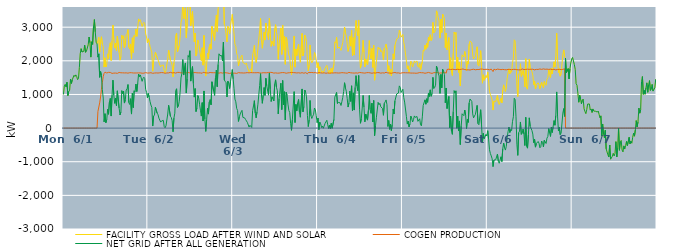
| Category | FACILITY GROSS LOAD AFTER WIND AND SOLAR | COGEN PRODUCTION | NET GRID AFTER ALL GENERATION |
|---|---|---|---|
|  Mon  6/1 | 1001 | 0 | 1001 |
|  Mon  6/1 | 1249 | 0 | 1249 |
|  Mon  6/1 | 1301 | 0 | 1301 |
|  Mon  6/1 | 1223 | 0 | 1223 |
|  Mon  6/1 | 1361 | 0 | 1361 |
|  Mon  6/1 | 967 | 0 | 967 |
|  Mon  6/1 | 1091 | 0 | 1091 |
|  Mon  6/1 | 1126 | 0 | 1126 |
|  Mon  6/1 | 1458 | 0 | 1458 |
|  Mon  6/1 | 1327 | 0 | 1327 |
|  Mon  6/1 | 1439 | 0 | 1439 |
|  Mon  6/1 | 1437 | 0 | 1437 |
|  Mon  6/1 | 1570 | 0 | 1570 |
|  Mon  6/1 | 1533 | 0 | 1533 |
|  Mon  6/1 | 1582 | 0 | 1582 |
|  Mon  6/1 | 1532 | 0 | 1532 |
|  Mon  6/1 | 1440 | 0 | 1440 |
|  Mon  6/1 | 1471 | 0 | 1471 |
|  Mon  6/1 | 1798 | 0 | 1798 |
|  Mon  6/1 | 2211 | 0 | 2211 |
|  Mon  6/1 | 2360 | 0 | 2360 |
|  Mon  6/1 | 2264 | 0 | 2264 |
|  Mon  6/1 | 2266 | 0 | 2266 |
|  Mon  6/1 | 2281 | 0 | 2281 |
|  Mon  6/1 | 2466 | 0 | 2466 |
|  Mon  6/1 | 2252 | 0 | 2252 |
|  Mon  6/1 | 2286 | 0 | 2286 |
|  Mon  6/1 | 2289 | 0 | 2289 |
|  Mon  6/1 | 2479 | 0 | 2479 |
|  Mon  6/1 | 2707 | 0 | 2707 |
|  Mon  6/1 | 2536 | 0 | 2536 |
|  Mon  6/1 | 2110 | 0 | 2110 |
|  Mon  6/1 | 2566 | 0 | 2566 |
|  Mon  6/1 | 2490 | 0 | 2490 |
|  Mon  6/1 | 3004 | 0 | 3004 |
|  Mon  6/1 | 3226 | 0 | 3226 |
|  Mon  6/1 | 2861 | 0 | 2861 |
|  Mon  6/1 | 2552 | 0 | 2552 |
|  Mon  6/1 | 2504 | 0 | 2504 |
|  Mon  6/1 | 2602 | 492 | 2110 |
|  Mon  6/1 | 2701 | 494 | 2207 |
|  Mon  6/1 | 2260 | 751 | 1509 |
|  Mon  6/1 | 2607 | 925 | 1682 |
|  Mon  6/1 | 2716 | 1152 | 1564 |
|  Mon  6/1 | 2489 | 1348 | 1141 |
|  Mon  6/1 | 2423 | 1530 | 893 |
|  Mon  6/1 | 1814 | 1629 | 185 |
|  Mon  6/1 | 2091 | 1663 | 428 |
|  Mon  6/1 | 1817 | 1657 | 160 |
|  Mon  6/1 | 1893 | 1638 | 255 |
|  Mon  6/1 | 2207 | 1648 | 559 |
|  Mon  6/1 | 2068 | 1657 | 411 |
|  Mon  6/1 | 2423 | 1650 | 773 |
|  Mon  6/1 | 2537 | 1654 | 883 |
|  Mon  6/1 | 2010 | 1652 | 358 |
|  Mon  6/1 | 2604 | 1626 | 978 |
|  Mon  6/1 | 3063 | 1638 | 1425 |
|  Mon  6/1 | 2615 | 1635 | 980 |
|  Mon  6/1 | 2379 | 1644 | 735 |
|  Mon  6/1 | 2525 | 1636 | 889 |
|  Mon  6/1 | 2305 | 1638 | 667 |
|  Mon  6/1 | 2736 | 1628 | 1108 |
|  Mon  6/1 | 2750 | 1626 | 1124 |
|  Mon  6/1 | 2245 | 1654 | 591 |
|  Mon  6/1 | 2020 | 1630 | 390 |
|  Mon  6/1 | 2123 | 1644 | 479 |
|  Mon  6/1 | 2760 | 1647 | 1113 |
|  Mon  6/1 | 2667 | 1643 | 1024 |
|  Mon  6/1 | 2742 | 1640 | 1102 |
|  Mon  6/1 | 2384 | 1640 | 744 |
|  Mon  6/1 | 2488 | 1646 | 842 |
|  Mon  6/1 | 2775 | 1642 | 1133 |
|  Mon  6/1 | 2807 | 1640 | 1167 |
|  Mon  6/1 | 2929 | 1634 | 1295 |
|  Mon  6/1 | 2405 | 1647 | 758 |
|  Mon  6/1 | 2348 | 1647 | 701 |
|  Mon  6/1 | 2501 | 1627 | 874 |
|  Mon  6/1 | 2063 | 1646 | 417 |
|  Mon  6/1 | 2684 | 1641 | 1043 |
|  Mon  6/1 | 2247 | 1638 | 609 |
|  Mon  6/1 | 2755 | 1645 | 1110 |
|  Mon  6/1 | 2713 | 1638 | 1075 |
|  Mon  6/1 | 2946 | 1637 | 1309 |
|  Mon  6/1 | 2727 | 1639 | 1088 |
|  Mon  6/1 | 2962 | 1634 | 1328 |
|  Mon  6/1 | 3246 | 1640 | 1606 |
|  Mon  6/1 | 3175 | 1645 | 1530 |
|  Mon  6/1 | 3223 | 1642 | 1581 |
|  Mon  6/1 | 3235 | 1651 | 1584 |
|  Mon  6/1 | 3021 | 1631 | 1390 |
|  Mon  6/1 | 3108 | 1636 | 1472 |
|  Mon  6/1 | 3146 | 1633 | 1513 |
|  Mon  6/1 | 3106 | 1635 | 1471 |
|  Mon  6/1 | 2802 | 1649 | 1153 |
|  Mon  6/1 | 2710 | 1647 | 1063 |
|  Mon  6/1 | 2532 | 1636 | 896 |
|  Tue  6/2 | 2655 | 1623 | 1032 |
|  Tue  6/2 | 2560 | 1639 | 921 |
|  Tue  6/2 | 2427 | 1641 | 786 |
|  Tue  6/2 | 2332 | 1646 | 686 |
|  Tue  6/2 | 2258 | 1643 | 615 |
|  Tue  6/2 | 1690 | 1629 | 61 |
|  Tue  6/2 | 2000 | 1643 | 357 |
|  Tue  6/2 | 2028 | 1637 | 391 |
|  Tue  6/2 | 2259 | 1639 | 620 |
|  Tue  6/2 | 2240 | 1641 | 599 |
|  Tue  6/2 | 2097 | 1651 | 446 |
|  Tue  6/2 | 2035 | 1637 | 398 |
|  Tue  6/2 | 1948 | 1652 | 296 |
|  Tue  6/2 | 1965 | 1644 | 321 |
|  Tue  6/2 | 1819 | 1641 | 178 |
|  Tue  6/2 | 1862 | 1650 | 212 |
|  Tue  6/2 | 1859 | 1630 | 229 |
|  Tue  6/2 | 1875 | 1646 | 229 |
|  Tue  6/2 | 1697 | 1653 | 44 |
|  Tue  6/2 | 1640 | 1630 | 10 |
|  Tue  6/2 | 1713 | 1646 | 67 |
|  Tue  6/2 | 1687 | 1640 | 47 |
|  Tue  6/2 | 2069 | 1651 | 418 |
|  Tue  6/2 | 2319 | 1641 | 678 |
|  Tue  6/2 | 2299 | 1646 | 653 |
|  Tue  6/2 | 2011 | 1658 | 353 |
|  Tue  6/2 | 1961 | 1647 | 314 |
|  Tue  6/2 | 1857 | 1639 | 218 |
|  Tue  6/2 | 1522 | 1631 | -109 |
|  Tue  6/2 | 1946 | 1648 | 298 |
|  Tue  6/2 | 2095 | 1651 | 444 |
|  Tue  6/2 | 2752 | 1635 | 1117 |
|  Tue  6/2 | 2823 | 1654 | 1169 |
|  Tue  6/2 | 2266 | 1655 | 611 |
|  Tue  6/2 | 2290 | 1641 | 649 |
|  Tue  6/2 | 2455 | 1656 | 799 |
|  Tue  6/2 | 2707 | 1639 | 1068 |
|  Tue  6/2 | 3132 | 1640 | 1492 |
|  Tue  6/2 | 3259 | 1634 | 1625 |
|  Tue  6/2 | 3677 | 1640 | 2037 |
|  Tue  6/2 | 3244 | 1667 | 1577 |
|  Tue  6/2 | 3244 | 1645 | 1599 |
|  Tue  6/2 | 3573 | 1637 | 1936 |
|  Tue  6/2 | 2684 | 1642 | 1042 |
|  Tue  6/2 | 3111 | 1648 | 1463 |
|  Tue  6/2 | 3810 | 1653 | 2157 |
|  Tue  6/2 | 3759 | 1650 | 2109 |
|  Tue  6/2 | 3942 | 1641 | 2301 |
|  Tue  6/2 | 3042 | 1645 | 1397 |
|  Tue  6/2 | 3050 | 1637 | 1413 |
|  Tue  6/2 | 3471 | 1644 | 1827 |
|  Tue  6/2 | 2966 | 1646 | 1320 |
|  Tue  6/2 | 2565 | 1644 | 921 |
|  Tue  6/2 | 2826 | 1651 | 1175 |
|  Tue  6/2 | 2142 | 1650 | 492 |
|  Tue  6/2 | 2238 | 1643 | 595 |
|  Tue  6/2 | 2614 | 1645 | 969 |
|  Tue  6/2 | 2534 | 1642 | 892 |
|  Tue  6/2 | 2344 | 1636 | 708 |
|  Tue  6/2 | 2172 | 1640 | 532 |
|  Tue  6/2 | 2005 | 1648 | 357 |
|  Tue  6/2 | 2388 | 1630 | 758 |
|  Tue  6/2 | 1870 | 1660 | 210 |
|  Tue  6/2 | 2755 | 1651 | 1104 |
|  Tue  6/2 | 1916 | 1646 | 270 |
|  Tue  6/2 | 1546 | 1645 | -99 |
|  Tue  6/2 | 1893 | 1640 | 253 |
|  Tue  6/2 | 2231 | 1641 | 590 |
|  Tue  6/2 | 2054 | 1638 | 416 |
|  Tue  6/2 | 2418 | 1641 | 777 |
|  Tue  6/2 | 2501 | 1653 | 848 |
|  Tue  6/2 | 2346 | 1653 | 693 |
|  Tue  6/2 | 3024 | 1647 | 1377 |
|  Tue  6/2 | 3014 | 1640 | 1374 |
|  Tue  6/2 | 2736 | 1646 | 1090 |
|  Tue  6/2 | 2605 | 1633 | 972 |
|  Tue  6/2 | 3139 | 1645 | 1494 |
|  Tue  6/2 | 3363 | 1636 | 1727 |
|  Tue  6/2 | 2871 | 1641 | 1230 |
|  Tue  6/2 | 3539 | 1647 | 1892 |
|  Tue  6/2 | 3843 | 1634 | 2209 |
|  Tue  6/2 | 3817 | 1660 | 2157 |
|  Tue  6/2 | 3791 | 1647 | 2144 |
|  Tue  6/2 | 3804 | 1650 | 2154 |
|  Tue  6/2 | 3631 | 1635 | 1996 |
|  Tue  6/2 | 4210 | 1651 | 2559 |
|  Tue  6/2 | 3081 | 1649 | 1432 |
|  Tue  6/2 | 3016 | 1629 | 1387 |
|  Tue  6/2 | 2993 | 1643 | 1350 |
|  Tue  6/2 | 2563 | 1639 | 924 |
|  Tue  6/2 | 3029 | 1636 | 1393 |
|  Tue  6/2 | 2978 | 1650 | 1328 |
|  Tue  6/2 | 2800 | 1624 | 1176 |
|  Tue  6/2 | 3042 | 1652 | 1390 |
|  Tue  6/2 | 3028 | 1639 | 1389 |
|  Tue  6/2 | 3380 | 1640 | 1740 |
|  Wed  6/3 | 3096 | 1633 | 1463 |
|  Wed  6/3 | 2799 | 1628 | 1171 |
|  Wed  6/3 | 2495 | 1634 | 861 |
|  Wed  6/3 | 2427 | 1646 | 781 |
|  Wed  6/3 | 2210 | 1625 | 585 |
|  Wed  6/3 | 2159 | 1635 | 524 |
|  Wed  6/3 | 1847 | 1649 | 198 |
|  Wed  6/3 | 1981 | 1646 | 335 |
|  Wed  6/3 | 2062 | 1642 | 420 |
|  Wed  6/3 | 2128 | 1647 | 481 |
|  Wed  6/3 | 2169 | 1641 | 528 |
|  Wed  6/3 | 1964 | 1646 | 318 |
|  Wed  6/3 | 1928 | 1637 | 291 |
|  Wed  6/3 | 1957 | 1654 | 303 |
|  Wed  6/3 | 1899 | 1642 | 257 |
|  Wed  6/3 | 1936 | 1657 | 279 |
|  Wed  6/3 | 1821 | 1649 | 172 |
|  Wed  6/3 | 1817 | 1635 | 182 |
|  Wed  6/3 | 1674 | 1643 | 31 |
|  Wed  6/3 | 1724 | 1641 | 83 |
|  Wed  6/3 | 1761 | 1650 | 111 |
|  Wed  6/3 | 1658 | 1639 | 19 |
|  Wed  6/3 | 2167 | 1646 | 521 |
|  Wed  6/3 | 2294 | 1636 | 658 |
|  Wed  6/3 | 2461 | 1646 | 815 |
|  Wed  6/3 | 2100 | 1652 | 448 |
|  Wed  6/3 | 1950 | 1645 | 305 |
|  Wed  6/3 | 2125 | 1641 | 484 |
|  Wed  6/3 | 2360 | 1649 | 711 |
|  Wed  6/3 | 2336 | 1635 | 701 |
|  Wed  6/3 | 2911 | 1640 | 1271 |
|  Wed  6/3 | 3261 | 1644 | 1617 |
|  Wed  6/3 | 2625 | 1636 | 989 |
|  Wed  6/3 | 2375 | 1638 | 737 |
|  Wed  6/3 | 2624 | 1647 | 977 |
|  Wed  6/3 | 2854 | 1648 | 1206 |
|  Wed  6/3 | 2616 | 1644 | 972 |
|  Wed  6/3 | 3122 | 1642 | 1480 |
|  Wed  6/3 | 2901 | 1644 | 1257 |
|  Wed  6/3 | 2895 | 1639 | 1256 |
|  Wed  6/3 | 2634 | 1654 | 980 |
|  Wed  6/3 | 3267 | 1633 | 1634 |
|  Wed  6/3 | 2823 | 1657 | 1166 |
|  Wed  6/3 | 2430 | 1639 | 791 |
|  Wed  6/3 | 2583 | 1653 | 930 |
|  Wed  6/3 | 2579 | 1647 | 932 |
|  Wed  6/3 | 2440 | 1635 | 805 |
|  Wed  6/3 | 2946 | 1641 | 1305 |
|  Wed  6/3 | 3076 | 1641 | 1435 |
|  Wed  6/3 | 2842 | 1630 | 1212 |
|  Wed  6/3 | 2742 | 1634 | 1108 |
|  Wed  6/3 | 2046 | 1624 | 422 |
|  Wed  6/3 | 2510 | 1635 | 875 |
|  Wed  6/3 | 2499 | 1624 | 875 |
|  Wed  6/3 | 2979 | 1645 | 1334 |
|  Wed  6/3 | 2191 | 1641 | 550 |
|  Wed  6/3 | 3065 | 1650 | 1415 |
|  Wed  6/3 | 2332 | 1637 | 695 |
|  Wed  6/3 | 2729 | 1647 | 1082 |
|  Wed  6/3 | 1897 | 1655 | 242 |
|  Wed  6/3 | 2696 | 1631 | 1065 |
|  Wed  6/3 | 2611 | 1635 | 976 |
|  Wed  6/3 | 2354 | 1642 | 712 |
|  Wed  6/3 | 2163 | 1639 | 524 |
|  Wed  6/3 | 2108 | 1647 | 461 |
|  Wed  6/3 | 1781 | 1639 | 142 |
|  Wed  6/3 | 1587 | 1654 | -67 |
|  Wed  6/3 | 1885 | 1630 | 255 |
|  Wed  6/3 | 1906 | 1649 | 257 |
|  Wed  6/3 | 2739 | 1655 | 1084 |
|  Wed  6/3 | 1812 | 1646 | 166 |
|  Wed  6/3 | 2351 | 1647 | 704 |
|  Wed  6/3 | 2155 | 1639 | 516 |
|  Wed  6/3 | 2398 | 1642 | 756 |
|  Wed  6/3 | 2497 | 1645 | 852 |
|  Wed  6/3 | 2120 | 1647 | 473 |
|  Wed  6/3 | 1958 | 1635 | 323 |
|  Wed  6/3 | 1968 | 1641 | 327 |
|  Wed  6/3 | 2812 | 1648 | 1164 |
|  Wed  6/3 | 2144 | 1660 | 484 |
|  Wed  6/3 | 2271 | 1632 | 639 |
|  Wed  6/3 | 2768 | 1636 | 1132 |
|  Wed  6/3 | 2711 | 1648 | 1063 |
|  Wed  6/3 | 2568 | 1641 | 927 |
|  Wed  6/3 | 1991 | 1614 | 377 |
|  Wed  6/3 | 1698 | 1653 | 45 |
|  Wed  6/3 | 1883 | 1638 | 245 |
|  Wed  6/3 | 2471 | 1650 | 821 |
|  Wed  6/3 | 2017 | 1651 | 366 |
|  Wed  6/3 | 1940 | 1654 | 286 |
|  Wed  6/3 | 1995 | 1643 | 352 |
|  Wed  6/3 | 2056 | 1645 | 411 |
|  Wed  6/3 | 2250 | 1654 | 596 |
|  Wed  6/3 | 2198 | 1650 | 548 |
|  Wed  6/3 | 2023 | 1655 | 368 |
|  Wed  6/3 | 1796 | 1633 | 163 |
|  Thu  6/4 | 1943 | 1647 | 296 |
|  Thu  6/4 | 1608 | 1652 | -44 |
|  Thu  6/4 | 1825 | 1647 | 178 |
|  Thu  6/4 | 1770 | 1642 | 128 |
|  Thu  6/4 | 1651 | 1634 | 17 |
|  Thu  6/4 | 1696 | 1636 | 60 |
|  Thu  6/4 | 1642 | 1648 | -6 |
|  Thu  6/4 | 1624 | 1643 | -19 |
|  Thu  6/4 | 1779 | 1639 | 140 |
|  Thu  6/4 | 1765 | 1631 | 134 |
|  Thu  6/4 | 1866 | 1633 | 233 |
|  Thu  6/4 | 1737 | 1639 | 98 |
|  Thu  6/4 | 1630 | 1642 | -12 |
|  Thu  6/4 | 1719 | 1633 | 86 |
|  Thu  6/4 | 1619 | 1641 | -22 |
|  Thu  6/4 | 1780 | 1638 | 142 |
|  Thu  6/4 | 1641 | 1647 | -6 |
|  Thu  6/4 | 1632 | 1638 | -6 |
|  Thu  6/4 | 1899 | 1641 | 258 |
|  Thu  6/4 | 2564 | 1643 | 921 |
|  Thu  6/4 | 2527 | 1628 | 899 |
|  Thu  6/4 | 2702 | 1642 | 1060 |
|  Thu  6/4 | 2375 | 1644 | 731 |
|  Thu  6/4 | 2401 | 1637 | 764 |
|  Thu  6/4 | 2410 | 1636 | 774 |
|  Thu  6/4 | 2391 | 1640 | 751 |
|  Thu  6/4 | 2309 | 1637 | 672 |
|  Thu  6/4 | 2433 | 1648 | 785 |
|  Thu  6/4 | 2549 | 1642 | 907 |
|  Thu  6/4 | 2733 | 1644 | 1089 |
|  Thu  6/4 | 3005 | 1657 | 1348 |
|  Thu  6/4 | 2835 | 1638 | 1197 |
|  Thu  6/4 | 2736 | 1641 | 1095 |
|  Thu  6/4 | 2518 | 1632 | 886 |
|  Thu  6/4 | 2280 | 1654 | 626 |
|  Thu  6/4 | 2400 | 1656 | 744 |
|  Thu  6/4 | 2734 | 1635 | 1099 |
|  Thu  6/4 | 2436 | 1643 | 793 |
|  Thu  6/4 | 2903 | 1646 | 1257 |
|  Thu  6/4 | 2152 | 1639 | 513 |
|  Thu  6/4 | 2689 | 1642 | 1047 |
|  Thu  6/4 | 2171 | 1635 | 536 |
|  Thu  6/4 | 2841 | 1631 | 1210 |
|  Thu  6/4 | 3199 | 1641 | 1558 |
|  Thu  6/4 | 2897 | 1647 | 1250 |
|  Thu  6/4 | 2747 | 1635 | 1112 |
|  Thu  6/4 | 3214 | 1651 | 1563 |
|  Thu  6/4 | 2209 | 1654 | 555 |
|  Thu  6/4 | 1782 | 1639 | 143 |
|  Thu  6/4 | 1922 | 1647 | 275 |
|  Thu  6/4 | 2238 | 1643 | 595 |
|  Thu  6/4 | 2609 | 1640 | 969 |
|  Thu  6/4 | 2250 | 1629 | 621 |
|  Thu  6/4 | 1820 | 1635 | 185 |
|  Thu  6/4 | 2056 | 1639 | 417 |
|  Thu  6/4 | 2036 | 1647 | 389 |
|  Thu  6/4 | 1877 | 1640 | 237 |
|  Thu  6/4 | 2180 | 1650 | 530 |
|  Thu  6/4 | 2601 | 1632 | 969 |
|  Thu  6/4 | 2189 | 1642 | 547 |
|  Thu  6/4 | 2064 | 1625 | 439 |
|  Thu  6/4 | 2371 | 1631 | 740 |
|  Thu  6/4 | 1804 | 1623 | 181 |
|  Thu  6/4 | 2464 | 1642 | 822 |
|  Thu  6/4 | 1424 | 1648 | -224 |
|  Thu  6/4 | 1704 | 1636 | 68 |
|  Thu  6/4 | 1956 | 1649 | 307 |
|  Thu  6/4 | 1958 | 1650 | 308 |
|  Thu  6/4 | 2406 | 1645 | 761 |
|  Thu  6/4 | 2347 | 1649 | 698 |
|  Thu  6/4 | 2385 | 1649 | 736 |
|  Thu  6/4 | 2269 | 1633 | 636 |
|  Thu  6/4 | 2305 | 1646 | 659 |
|  Thu  6/4 | 2223 | 1643 | 580 |
|  Thu  6/4 | 2023 | 1642 | 381 |
|  Thu  6/4 | 2372 | 1636 | 736 |
|  Thu  6/4 | 2402 | 1622 | 780 |
|  Thu  6/4 | 2497 | 1660 | 837 |
|  Thu  6/4 | 2343 | 1647 | 696 |
|  Thu  6/4 | 1688 | 1639 | 49 |
|  Thu  6/4 | 1854 | 1629 | 225 |
|  Thu  6/4 | 1601 | 1637 | -36 |
|  Thu  6/4 | 1758 | 1639 | 119 |
|  Thu  6/4 | 1555 | 1630 | -75 |
|  Thu  6/4 | 1747 | 1638 | 109 |
|  Thu  6/4 | 2207 | 1644 | 563 |
|  Thu  6/4 | 2045 | 1627 | 418 |
|  Thu  6/4 | 2460 | 1652 | 808 |
|  Thu  6/4 | 2436 | 1649 | 787 |
|  Thu  6/4 | 2653 | 1639 | 1014 |
|  Thu  6/4 | 2632 | 1644 | 988 |
|  Thu  6/4 | 2686 | 1642 | 1044 |
|  Thu  6/4 | 2906 | 1651 | 1255 |
|  Thu  6/4 | 2838 | 1628 | 1210 |
|  Thu  6/4 | 2703 | 1646 | 1057 |
|  Thu  6/4 | 2679 | 1643 | 1036 |
|  Fri  6/5 | 2783 | 1628 | 1155 |
|  Fri  6/5 | 2555 | 1647 | 908 |
|  Fri  6/5 | 2412 | 1639 | 773 |
|  Fri  6/5 | 2411 | 1644 | 767 |
|  Fri  6/5 | 1994 | 1652 | 342 |
|  Fri  6/5 | 1762 | 1643 | 119 |
|  Fri  6/5 | 1850 | 1644 | 206 |
|  Fri  6/5 | 1679 | 1643 | 36 |
|  Fri  6/5 | 1766 | 1641 | 125 |
|  Fri  6/5 | 1991 | 1636 | 355 |
|  Fri  6/5 | 1940 | 1654 | 286 |
|  Fri  6/5 | 1817 | 1636 | 181 |
|  Fri  6/5 | 1894 | 1644 | 250 |
|  Fri  6/5 | 1997 | 1635 | 362 |
|  Fri  6/5 | 1950 | 1631 | 319 |
|  Fri  6/5 | 1978 | 1630 | 348 |
|  Fri  6/5 | 1995 | 1650 | 345 |
|  Fri  6/5 | 1837 | 1636 | 201 |
|  Fri  6/5 | 1807 | 1626 | 181 |
|  Fri  6/5 | 1928 | 1651 | 277 |
|  Fri  6/5 | 1728 | 1629 | 99 |
|  Fri  6/5 | 1713 | 1646 | 67 |
|  Fri  6/5 | 1979 | 1645 | 334 |
|  Fri  6/5 | 2318 | 1644 | 674 |
|  Fri  6/5 | 2286 | 1629 | 657 |
|  Fri  6/5 | 2470 | 1630 | 840 |
|  Fri  6/5 | 2345 | 1635 | 710 |
|  Fri  6/5 | 2514 | 1641 | 873 |
|  Fri  6/5 | 2403 | 1637 | 766 |
|  Fri  6/5 | 2699 | 1655 | 1044 |
|  Fri  6/5 | 2589 | 1649 | 940 |
|  Fri  6/5 | 2775 | 1638 | 1137 |
|  Fri  6/5 | 2601 | 1655 | 946 |
|  Fri  6/5 | 2651 | 1626 | 1025 |
|  Fri  6/5 | 3143 | 1635 | 1508 |
|  Fri  6/5 | 2825 | 1647 | 1178 |
|  Fri  6/5 | 2855 | 1647 | 1208 |
|  Fri  6/5 | 2923 | 1649 | 1274 |
|  Fri  6/5 | 3486 | 1642 | 1844 |
|  Fri  6/5 | 3407 | 1651 | 1756 |
|  Fri  6/5 | 3279 | 1648 | 1631 |
|  Fri  6/5 | 3181 | 1632 | 1549 |
|  Fri  6/5 | 2675 | 1644 | 1031 |
|  Fri  6/5 | 3234 | 1639 | 1595 |
|  Fri  6/5 | 2844 | 1647 | 1197 |
|  Fri  6/5 | 3385 | 1639 | 1746 |
|  Fri  6/5 | 3331 | 1646 | 1685 |
|  Fri  6/5 | 3256 | 1660 | 1596 |
|  Fri  6/5 | 2391 | 1639 | 752 |
|  Fri  6/5 | 2825 | 1633 | 1192 |
|  Fri  6/5 | 2325 | 1744 | 581 |
|  Fri  6/5 | 2341 | 1739 | 602 |
|  Fri  6/5 | 2690 | 1751 | 939 |
|  Fri  6/5 | 1763 | 1750 | 13 |
|  Fri  6/5 | 2091 | 1740 | 351 |
|  Fri  6/5 | 1666 | 1756 | -90 |
|  Fri  6/5 | 1563 | 1749 | -186 |
|  Fri  6/5 | 2224 | 1732 | 492 |
|  Fri  6/5 | 2855 | 1743 | 1112 |
|  Fri  6/5 | 2791 | 1746 | 1045 |
|  Fri  6/5 | 2843 | 1735 | 1108 |
|  Fri  6/5 | 1733 | 1737 | -4 |
|  Fri  6/5 | 2105 | 1750 | 355 |
|  Fri  6/5 | 1656 | 1743 | -87 |
|  Fri  6/5 | 1952 | 1739 | 213 |
|  Fri  6/5 | 1255 | 1744 | -489 |
|  Fri  6/5 | 1805 | 1748 | 57 |
|  Fri  6/5 | 2178 | 1752 | 426 |
|  Fri  6/5 | 2197 | 1758 | 439 |
|  Fri  6/5 | 2114 | 1745 | 369 |
|  Fri  6/5 | 2277 | 1740 | 537 |
|  Fri  6/5 | 2129 | 1747 | 382 |
|  Fri  6/5 | 1715 | 1731 | -16 |
|  Fri  6/5 | 1995 | 1738 | 257 |
|  Fri  6/5 | 1903 | 1733 | 170 |
|  Fri  6/5 | 2493 | 1745 | 748 |
|  Fri  6/5 | 2591 | 1726 | 865 |
|  Fri  6/5 | 2612 | 1755 | 857 |
|  Fri  6/5 | 2533 | 1742 | 791 |
|  Fri  6/5 | 2179 | 1757 | 422 |
|  Fri  6/5 | 2054 | 1750 | 304 |
|  Fri  6/5 | 2101 | 1739 | 362 |
|  Fri  6/5 | 2134 | 1733 | 401 |
|  Fri  6/5 | 2113 | 1741 | 372 |
|  Fri  6/5 | 2416 | 1742 | 674 |
|  Fri  6/5 | 1879 | 1746 | 133 |
|  Fri  6/5 | 1841 | 1741 | 100 |
|  Fri  6/5 | 1842 | 1742 | 100 |
|  Fri  6/5 | 2301 | 1755 | 546 |
|  Fri  6/5 | 1830 | 1733 | 97 |
|  Fri  6/5 | 1335 | 1753 | -418 |
|  Fri  6/5 | 1585 | 1741 | -156 |
|  Fri  6/5 | 1422 | 1741 | -319 |
|  Fri  6/5 | 1443 | 1753 | -310 |
|  Fri  6/5 | 1562 | 1748 | -186 |
|  Fri  6/5 | 1499 | 1734 | -235 |
|  Sat  6/6 | 1669 | 1746 | -77 |
|  Sat  6/6 | 1398 | 1738 | -340 |
|  Sat  6/6 | 1090 | 1734 | -644 |
|  Sat  6/6 | 996 | 1751 | -755 |
|  Sat  6/6 | 926 | 1753 | -827 |
|  Sat  6/6 | 834 | 1747 | -913 |
|  Sat  6/6 | 536 | 1681 | -1145 |
|  Sat  6/6 | 802 | 1751 | -949 |
|  Sat  6/6 | 790 | 1742 | -952 |
|  Sat  6/6 | 788 | 1731 | -943 |
|  Sat  6/6 | 792 | 1746 | -954 |
|  Sat  6/6 | 982 | 1753 | -771 |
|  Sat  6/6 | 760 | 1746 | -986 |
|  Sat  6/6 | 701 | 1746 | -1045 |
|  Sat  6/6 | 686 | 1737 | -1051 |
|  Sat  6/6 | 884 | 1737 | -853 |
|  Sat  6/6 | 752 | 1746 | -994 |
|  Sat  6/6 | 1132 | 1745 | -613 |
|  Sat  6/6 | 1286 | 1730 | -444 |
|  Sat  6/6 | 1155 | 1737 | -582 |
|  Sat  6/6 | 1084 | 1738 | -654 |
|  Sat  6/6 | 1192 | 1733 | -541 |
|  Sat  6/6 | 1473 | 1758 | -285 |
|  Sat  6/6 | 1637 | 1744 | -107 |
|  Sat  6/6 | 1763 | 1735 | 28 |
|  Sat  6/6 | 1614 | 1744 | -130 |
|  Sat  6/6 | 1706 | 1748 | -42 |
|  Sat  6/6 | 1661 | 1735 | -74 |
|  Sat  6/6 | 1947 | 1757 | 190 |
|  Sat  6/6 | 2084 | 1746 | 338 |
|  Sat  6/6 | 2625 | 1738 | 887 |
|  Sat  6/6 | 2590 | 1746 | 844 |
|  Sat  6/6 | 2074 | 1738 | 336 |
|  Sat  6/6 | 1258 | 1736 | -478 |
|  Sat  6/6 | 937 | 1748 | -811 |
|  Sat  6/6 | 1596 | 1732 | -136 |
|  Sat  6/6 | 1653 | 1743 | -90 |
|  Sat  6/6 | 1913 | 1731 | 182 |
|  Sat  6/6 | 1538 | 1726 | -188 |
|  Sat  6/6 | 1607 | 1759 | -152 |
|  Sat  6/6 | 1717 | 1747 | -30 |
|  Sat  6/6 | 1559 | 1740 | -181 |
|  Sat  6/6 | 1227 | 1745 | -518 |
|  Sat  6/6 | 2063 | 1744 | 319 |
|  Sat  6/6 | 1193 | 1735 | -542 |
|  Sat  6/6 | 1155 | 1752 | -597 |
|  Sat  6/6 | 1545 | 1749 | -204 |
|  Sat  6/6 | 2050 | 1745 | 305 |
|  Sat  6/6 | 1792 | 1738 | 54 |
|  Sat  6/6 | 1816 | 1750 | 66 |
|  Sat  6/6 | 1683 | 1756 | -73 |
|  Sat  6/6 | 1572 | 1750 | -178 |
|  Sat  6/6 | 1289 | 1724 | -435 |
|  Sat  6/6 | 1402 | 1732 | -330 |
|  Sat  6/6 | 1163 | 1729 | -566 |
|  Sat  6/6 | 1288 | 1746 | -458 |
|  Sat  6/6 | 1283 | 1746 | -463 |
|  Sat  6/6 | 1346 | 1744 | -398 |
|  Sat  6/6 | 1288 | 1736 | -448 |
|  Sat  6/6 | 1172 | 1758 | -586 |
|  Sat  6/6 | 1193 | 1749 | -556 |
|  Sat  6/6 | 1361 | 1746 | -385 |
|  Sat  6/6 | 1332 | 1759 | -427 |
|  Sat  6/6 | 1202 | 1760 | -558 |
|  Sat  6/6 | 1386 | 1747 | -361 |
|  Sat  6/6 | 1375 | 1748 | -373 |
|  Sat  6/6 | 1274 | 1732 | -458 |
|  Sat  6/6 | 1453 | 1753 | -300 |
|  Sat  6/6 | 1497 | 1747 | -250 |
|  Sat  6/6 | 1732 | 1745 | -13 |
|  Sat  6/6 | 1608 | 1748 | -140 |
|  Sat  6/6 | 1503 | 1751 | -248 |
|  Sat  6/6 | 1775 | 1749 | 26 |
|  Sat  6/6 | 1609 | 1740 | -131 |
|  Sat  6/6 | 1788 | 1746 | 42 |
|  Sat  6/6 | 1971 | 1749 | 222 |
|  Sat  6/6 | 1813 | 1728 | 85 |
|  Sat  6/6 | 2104 | 1730 | 374 |
|  Sat  6/6 | 2821 | 1746 | 1075 |
|  Sat  6/6 | 2085 | 1743 | 342 |
|  Sat  6/6 | 1651 | 1738 | -87 |
|  Sat  6/6 | 1767 | 1746 | 21 |
|  Sat  6/6 | 1543 | 1738 | -195 |
|  Sat  6/6 | 1591 | 1740 | -149 |
|  Sat  6/6 | 1602 | 1743 | -141 |
|  Sat  6/6 | 2192 | 1745 | 447 |
|  Sat  6/6 | 2324 | 1744 | 580 |
|  Sat  6/6 | 2111 | 1763 | 348 |
|  Sat  6/6 | 2071 | 0 | 2071 |
|  Sat  6/6 | 1648 | 0 | 1648 |
|  Sat  6/6 | 1633 | 0 | 1633 |
|  Sat  6/6 | 1768 | 0 | 1768 |
|  Sat  6/6 | 1461 | 0 | 1461 |
|  Sat  6/6 | 1757 | 0 | 1757 |
|  Sat  6/6 | 1936 | 0 | 1936 |
|  Sat  6/6 | 2052 | 0 | 2052 |
|  Sun  6/7 | 2100 | 0 | 2100 |
|  Sun  6/7 | 2113 | 0 | 2113 |
|  Sun  6/7 | 1885 | 0 | 1885 |
|  Sun  6/7 | 1743 | 0 | 1743 |
|  Sun  6/7 | 1322 | 0 | 1322 |
|  Sun  6/7 | 1272 | 0 | 1272 |
|  Sun  6/7 | 1034 | 0 | 1034 |
|  Sun  6/7 | 769 | 0 | 769 |
|  Sun  6/7 | 978 | 0 | 978 |
|  Sun  6/7 | 871 | 0 | 871 |
|  Sun  6/7 | 721 | 0 | 721 |
|  Sun  6/7 | 830 | 0 | 830 |
|  Sun  6/7 | 863 | 0 | 863 |
|  Sun  6/7 | 575 | 0 | 575 |
|  Sun  6/7 | 493 | 0 | 493 |
|  Sun  6/7 | 430 | 0 | 430 |
|  Sun  6/7 | 545 | 0 | 545 |
|  Sun  6/7 | 714 | 0 | 714 |
|  Sun  6/7 | 739 | 0 | 739 |
|  Sun  6/7 | 717 | 0 | 717 |
|  Sun  6/7 | 535 | 0 | 535 |
|  Sun  6/7 | 569 | 0 | 569 |
|  Sun  6/7 | 464 | 0 | 464 |
|  Sun  6/7 | 569 | 0 | 569 |
|  Sun  6/7 | 507 | 0 | 507 |
|  Sun  6/7 | 529 | 0 | 529 |
|  Sun  6/7 | 499 | 0 | 499 |
|  Sun  6/7 | 490 | 0 | 490 |
|  Sun  6/7 | 477 | 0 | 477 |
|  Sun  6/7 | 507 | 0 | 507 |
|  Sun  6/7 | 407 | 0 | 407 |
|  Sun  6/7 | 305 | 0 | 305 |
|  Sun  6/7 | 364 | 0 | 364 |
|  Sun  6/7 | -239 | 0 | -239 |
|  Sun  6/7 | 122 | 0 | 122 |
|  Sun  6/7 | -178 | 0 | -178 |
|  Sun  6/7 | -285 | 0 | -285 |
|  Sun  6/7 | -65 | 0 | -65 |
|  Sun  6/7 | -619 | 0 | -619 |
|  Sun  6/7 | -709 | 0 | -709 |
|  Sun  6/7 | -796 | 0 | -796 |
|  Sun  6/7 | -860 | 0 | -860 |
|  Sun  6/7 | -503 | 0 | -503 |
|  Sun  6/7 | -924 | 0 | -924 |
|  Sun  6/7 | -905 | 0 | -905 |
|  Sun  6/7 | -837 | 0 | -837 |
|  Sun  6/7 | -750 | 0 | -750 |
|  Sun  6/7 | -829 | 0 | -829 |
|  Sun  6/7 | -754 | 0 | -754 |
|  Sun  6/7 | -403 | 0 | -403 |
|  Sun  6/7 | -858 | 0 | -858 |
|  Sun  6/7 | -596 | 0 | -596 |
|  Sun  6/7 | -3 | 0 | -3 |
|  Sun  6/7 | -660 | 0 | -660 |
|  Sun  6/7 | -407 | 0 | -407 |
|  Sun  6/7 | -368 | 0 | -368 |
|  Sun  6/7 | -651 | 0 | -651 |
|  Sun  6/7 | -708 | 0 | -708 |
|  Sun  6/7 | -529 | 0 | -529 |
|  Sun  6/7 | -623 | 0 | -623 |
|  Sun  6/7 | -523 | 0 | -523 |
|  Sun  6/7 | -397 | 0 | -397 |
|  Sun  6/7 | -520 | 0 | -520 |
|  Sun  6/7 | -536 | 0 | -536 |
|  Sun  6/7 | -275 | 0 | -275 |
|  Sun  6/7 | -468 | 0 | -468 |
|  Sun  6/7 | -384 | 0 | -384 |
|  Sun  6/7 | -450 | 0 | -450 |
|  Sun  6/7 | -273 | 0 | -273 |
|  Sun  6/7 | -151 | 0 | -151 |
|  Sun  6/7 | -240 | 0 | -240 |
|  Sun  6/7 | -55 | 0 | -55 |
|  Sun  6/7 | 222 | 0 | 222 |
|  Sun  6/7 | 34 | 0 | 34 |
|  Sun  6/7 | 184 | 0 | 184 |
|  Sun  6/7 | 594 | 0 | 594 |
|  Sun  6/7 | 444 | 0 | 444 |
|  Sun  6/7 | 545 | 0 | 545 |
|  Sun  6/7 | 1378 | 0 | 1378 |
|  Sun  6/7 | 1532 | 0 | 1532 |
|  Sun  6/7 | 1004 | 0 | 1004 |
|  Sun  6/7 | 1121 | 0 | 1121 |
|  Sun  6/7 | 1008 | 0 | 1008 |
|  Sun  6/7 | 1191 | 0 | 1191 |
|  Sun  6/7 | 1345 | 0 | 1345 |
|  Sun  6/7 | 1065 | 0 | 1065 |
|  Sun  6/7 | 1281 | 0 | 1281 |
|  Sun  6/7 | 1411 | 0 | 1411 |
|  Sun  6/7 | 1118 | 0 | 1118 |
|  Sun  6/7 | 1153 | 0 | 1153 |
|  Sun  6/7 | 1298 | 0 | 1298 |
|  Sun  6/7 | 1100 | 0 | 1100 |
|  Sun  6/7 | 1126 | 0 | 1126 |
|  Sun  6/7 | 1194 | 0 | 1194 |
|  Sun  6/7 | 1445 | 0 | 1445 |
|  Sun  6/7 | 1400 | 0 | 1400 |